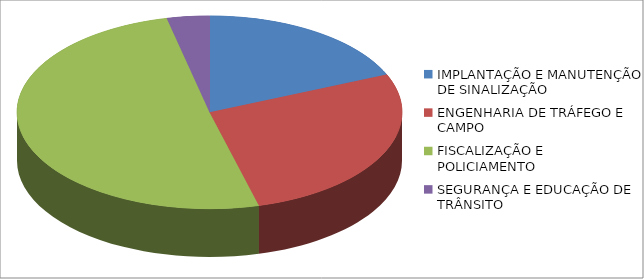
| Category | Series 0 | Series 1 |
|---|---|---|
| IMPLANTAÇÃO E MANUTENÇÃO DE SINALIZAÇÃO | 2459404.26 |  |
| ENGENHARIA DE TRÁFEGO E CAMPO | 3614618.27 |  |
| FISCALIZAÇÃO E POLICIAMENTO | 6693520.67 |  |
| SEGURANÇA E EDUCAÇÃO DE TRÂNSITO | 471427 |  |